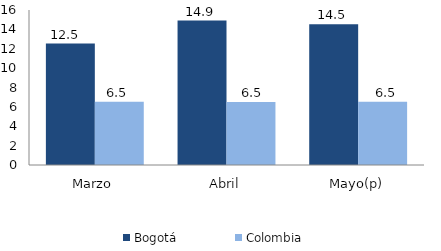
| Category | Bogotá | Colombia |
|---|---|---|
| Marzo | 12.54 | 6.53 |
| Abril | 14.904 | 6.505 |
| Mayo(p) | 14.518 | 6.53 |